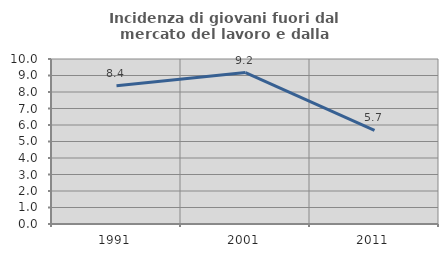
| Category | Incidenza di giovani fuori dal mercato del lavoro e dalla formazione  |
|---|---|
| 1991.0 | 8.386 |
| 2001.0 | 9.179 |
| 2011.0 | 5.674 |